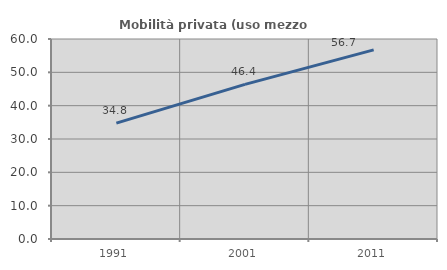
| Category | Mobilità privata (uso mezzo privato) |
|---|---|
| 1991.0 | 34.765 |
| 2001.0 | 46.386 |
| 2011.0 | 56.748 |